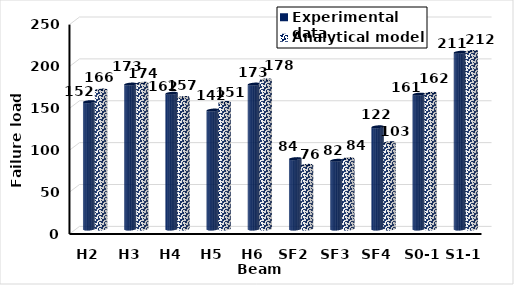
| Category | Experimental data | Analytical model |
|---|---|---|
| H2 | 152 | 166 |
| H3 | 173 | 174 |
| H4 | 162 | 157 |
| H5 | 142 | 151 |
| H6 | 173 | 178 |
| SF2 | 84 | 76 |
| SF3 | 82 | 84 |
| SF4 | 122 | 103 |
| S0-1 | 161 | 162 |
| S1-1 | 211 | 212 |